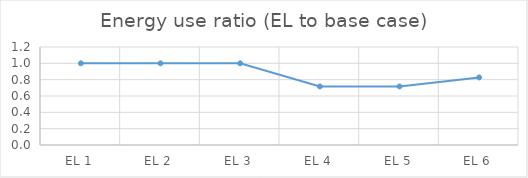
| Category | Energy use ratio (EL to base case) |
|---|---|
| EL 1 | 1 |
| EL 2 | 1 |
| EL 3 | 1 |
| EL 4 | 0.717 |
| EL 5 | 0.717 |
| EL 6 | 0.828 |